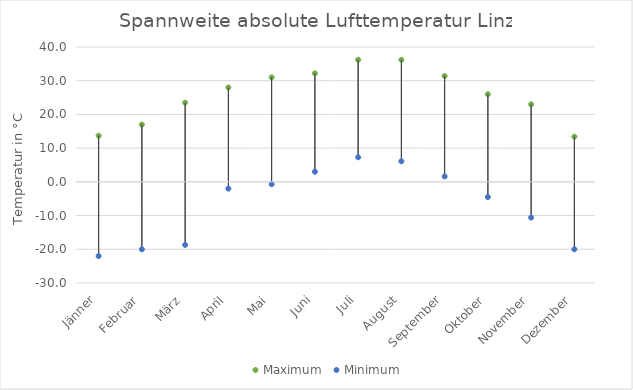
| Category | Maximum | Minimum |
|---|---|---|
| Jänner | 13.7 | -22 |
| Februar | 17 | -20 |
| März | 23.5 | -18.7 |
| April | 28 | -2 |
| Mai | 31 | -0.7 |
| Juni | 32.2 | 3 |
| Juli | 36.2 | 7.3 |
| August | 36.2 | 6.1 |
| September | 31.4 | 1.6 |
| Oktober | 26 | -4.5 |
| November | 23 | -10.6 |
| Dezember | 13.4 | -20 |